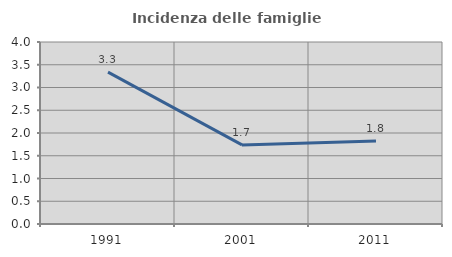
| Category | Incidenza delle famiglie numerose |
|---|---|
| 1991.0 | 3.339 |
| 2001.0 | 1.739 |
| 2011.0 | 1.826 |